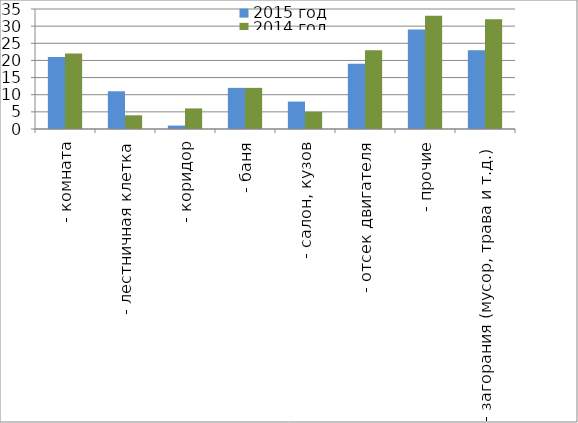
| Category | 2015 год | 2014 год |
|---|---|---|
|  - комната | 21 | 22 |
|  - лестничная клетка | 11 | 4 |
|  - коридор | 1 | 6 |
|  - баня | 12 | 12 |
|  - салон, кузов | 8 | 5 |
|  - отсек двигателя | 19 | 23 |
| - прочие | 29 | 33 |
| - загорания (мусор, трава и т.д.)  | 23 | 32 |